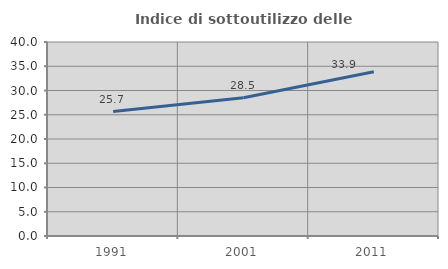
| Category | Indice di sottoutilizzo delle abitazioni  |
|---|---|
| 1991.0 | 25.657 |
| 2001.0 | 28.486 |
| 2011.0 | 33.851 |